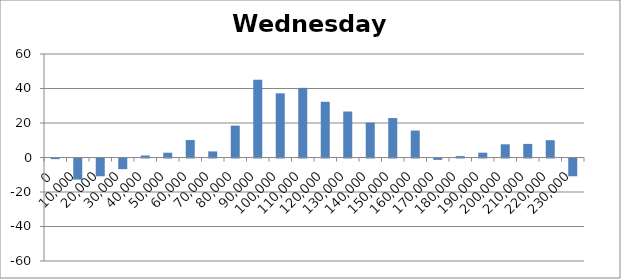
| Category | Wednesday 48 |
|---|---|
| 0.0 | -0.37 |
| 10000.0 | -12.235 |
| 20000.0 | -10.305 |
| 30000.0 | -6.2 |
| 40000.0 | 1.15 |
| 50000.0 | 2.77 |
| 60000.0 | 10.11 |
| 70000.0 | 3.535 |
| 80000.0 | 18.48 |
| 90000.0 | 45.075 |
| 100000.0 | 37.205 |
| 110000.0 | 40.37 |
| 120000.0 | 32.295 |
| 130000.0 | 26.67 |
| 140000.0 | 20.235 |
| 150000.0 | 22.865 |
| 160000.0 | 15.62 |
| 170000.0 | -0.795 |
| 180000.0 | 0.83 |
| 190000.0 | 2.795 |
| 200000.0 | 7.66 |
| 210000.0 | 7.88 |
| 220000.0 | 10.038 |
| 230000.0 | -10.31 |